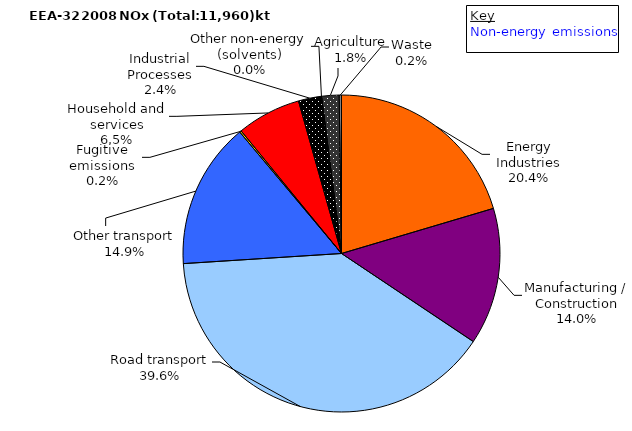
| Category | Series 0 |
|---|---|
| Energy Industries | 2422.808 |
| Manufacturing / Construction | 1658.231 |
| Road transport | 4702.041 |
| Other transport | 1771.123 |
| Fugitive emissions | 21.352 |
| Household and services | 777.214 |
| Industrial Processes | 279.101 |
| Other non-energy (solvents) | 1.089 |
| Agriculture | 211.284 |
| Waste | 27.816 |